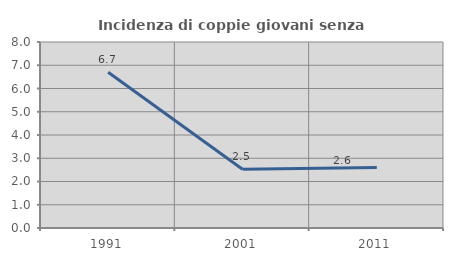
| Category | Incidenza di coppie giovani senza figli |
|---|---|
| 1991.0 | 6.702 |
| 2001.0 | 2.525 |
| 2011.0 | 2.603 |